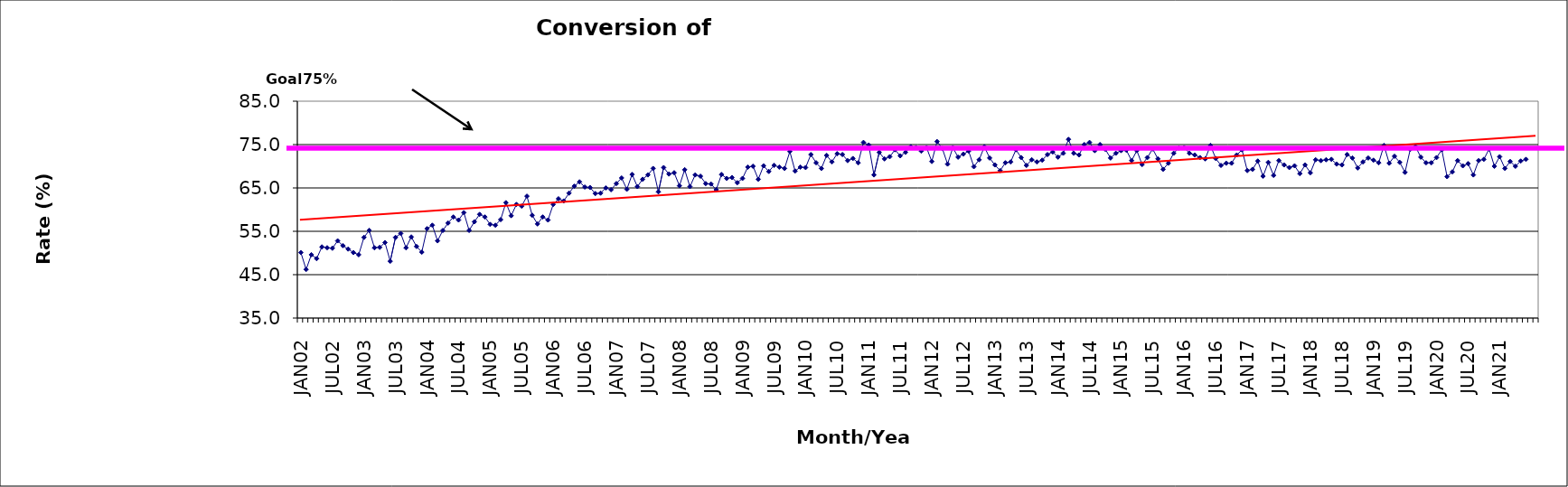
| Category | Series 0 |
|---|---|
| JAN02 | 50.1 |
| FEB02 | 46.2 |
| MAR02 | 49.6 |
| APR02 | 48.7 |
| MAY02 | 51.4 |
| JUN02 | 51.2 |
| JUL02 | 51.1 |
| AUG02 | 52.8 |
| SEP02 | 51.7 |
| OCT02 | 50.9 |
| NOV02 | 50.1 |
| DEC02 | 49.6 |
| JAN03 | 53.6 |
| FEB03 | 55.2 |
| MAR03 | 51.2 |
| APR03 | 51.3 |
| MAY03 | 52.4 |
| JUN03 | 48.1 |
| JUL03 | 53.6 |
| AUG03 | 54.5 |
| SEP03 | 51.2 |
| OCT03 | 53.7 |
| NOV03 | 51.5 |
| DEC03 | 50.2 |
| JAN04 | 55.6 |
| FEB04 | 56.4 |
| MAR04 | 52.8 |
| APR04 | 55.2 |
| MAY04 | 56.9 |
| JUN04 | 58.3 |
| JUL04 | 57.6 |
| AUG04 | 59.3 |
| SEP04 | 55.2 |
| OCT04 | 57.2 |
| NOV04 | 58.9 |
| DEC04 | 58.3 |
| JAN05 | 56.6 |
| FEB05 | 56.4 |
| MAR05 | 57.7 |
| APR05 | 61.6 |
| MAY05 | 58.6 |
| JUN05 | 61.2 |
| JUL05 | 60.8 |
| AUG05 | 63.1 |
| SEP05 | 58.7 |
| OCT05 | 56.7 |
| NOV05 | 58.3 |
| DEC05 | 57.6 |
| JAN06 | 61.2 |
| FEB06 | 62.5 |
| MAR06 | 62 |
| APR06 | 63.8 |
| MAY06 | 65.4 |
| JUN06 | 66.4 |
| JUL06 | 65.2 |
| AUG06 | 65.1 |
| SEP06 | 63.7 |
| OCT06 | 63.8 |
| NOV06 | 65 |
| DEC06 | 64.6 |
| JAN07 | 66 |
| FEB07 | 67.3 |
| MAR07 | 64.7 |
| APR07 | 68.1 |
| MAY07 | 65.3 |
| JUN07 | 67 |
| JUL07 | 68 |
| AUG07 | 69.5 |
| SEP07 | 64.1 |
| OCT07 | 69.7 |
| NOV07 | 68.2 |
| DEC07 | 68.5 |
| JAN08 | 65.5 |
| FEB08 | 69.2 |
| MAR08 | 65.3 |
| APR08 | 68 |
| MAY08 | 67.7 |
| JUN08 | 66 |
| JUL08 | 65.9 |
| AUG08 | 64.6 |
| SEP08 | 68.1 |
| OCT08 | 67.2 |
| NOV08 | 67.4 |
| DEC08 | 66.2 |
| JAN09 | 67.2 |
| FEB09 | 69.8 |
| MAR09 | 70 |
| APR09 | 67 |
| MAY09 | 70.1 |
| JUN09 | 68.8 |
| JUL09 | 70.2 |
| AUG09 | 69.8 |
| SEP09 | 69.5 |
| OCT09 | 73.4 |
| NOV09 | 68.9 |
| DEC09 | 69.8 |
| JAN10 | 69.7 |
| FEB10 | 72.7 |
| MAR10 | 70.8 |
| APR10 | 69.5 |
| MAY10 | 72.5 |
| JUN10 | 71 |
| JUL10 | 72.9 |
| AUG10 | 72.7 |
| SEP10 | 71.3 |
| OCT10 | 71.8 |
| NOV10 | 70.8 |
| DEC10 | 75.5 |
| JAN11 | 74.9 |
| FEB11 | 68 |
| MAR11 | 73.2 |
| APR11 | 71.7 |
| MAY11 | 72.2 |
| JUN11 | 73.8 |
| JUL11 | 72.4 |
| AUG11 | 73.2 |
| SEP11 | 74.5 |
| OCT11 | 74.3 |
| NOV11 | 73.5 |
| DEC11 | 74.3 |
| JAN12 | 71.1 |
| FEB12 | 75.7 |
| MAR12 | 74.1 |
| APR12 | 70.5 |
| MAY12 | 74.3 |
| JUN12 | 72.1 |
| JUL12 | 72.8 |
| AUG12 | 73.5 |
| SEP12 | 69.9 |
| OCT12 | 71.5 |
| NOV12 | 74.5 |
| DEC12 | 71.9 |
| JAN13 | 70.3 |
| FEB13 | 69 |
| MAR13 | 70.8 |
| APR13 | 71 |
| MAY13 | 73.8 |
| JUN13 | 72 |
| JUL13 | 70.2 |
| AUG13 | 71.5 |
| SEP13 | 71 |
| OCT13 | 71.4 |
| NOV13 | 72.7 |
| DEC13 | 73.3 |
| JAN14 | 72.1 |
| FEB14 | 73 |
| MAR14 | 76.2 |
| APR14 | 73 |
| MAY14 | 72.6 |
| JUN14 | 75 |
| JUL14 | 75.5 |
| AUG14 | 73.6 |
| SEP14 | 75 |
| OCT14 | 73.9 |
| NOV14 | 71.9 |
| DEC14 | 73 |
| JAN15 | 73.6 |
| FEB15 | 73.7 |
| MAR15 | 71.3 |
| APR15 | 73.6 |
| MAY15 | 70.4 |
| JUN15 | 72 |
| JUL15 | 74 |
| AUG15 | 71.7 |
| SEP15 | 69.3 |
| OCT15 | 70.7 |
| NOV15 | 73 |
| DEC15 | 74.2 |
| JAN16 | 74.3 |
| FEB16 | 73 |
| MAR16 | 72.6 |
| APR16 | 72 |
| MAY16 | 71.7 |
| JUN16 | 74.8 |
| JUL16 | 71.8 |
| AUG16 | 70.2 |
| SEP16 | 70.7 |
| OCT16 | 70.7 |
| NOV16 | 72.6 |
| DEC16 | 73.8 |
| JAN17 | 69 |
| FEB17 | 69.3 |
| MAR17 | 71.2 |
| APR17 | 67.7 |
| MAY17 | 70.9 |
| JUN17 | 67.9 |
| JUL17 | 71.3 |
| AUG17 | 70.3 |
| SEP17 | 69.7 |
| OCT17 | 70.1 |
| NOV17 | 68.3 |
| DEC17 | 70.3 |
| JAN18 | 68.5 |
| FEB18 | 71.5 |
| MAR18 | 71.3 |
| APR18 | 71.5 |
| MAY18 | 71.6 |
| JUN18 | 70.5 |
| JUL18 | 70.3 |
| AUG18 | 72.7 |
| SEP18 | 71.9 |
| OCT18 | 69.6 |
| NOV18 | 71 |
| DEC18 | 71.9 |
| JAN19 | 71.4 |
| FEB19 | 70.8 |
| MAR19 | 74.8 |
| APR19 | 70.7 |
| MAY19 | 72.3 |
| JUN19 | 70.9 |
| JUL19 | 68.6 |
| AUG19 | 73.9 |
| SEP19 | 74.5 |
| OCT19 | 72.1 |
| NOV19 | 70.8 |
| DEC19 | 70.8 |
| JAN20 | 72 |
| FEB20 | 73.8 |
| MAR20 | 67.6 |
| APR20 | 68.7 |
| MAY20 | 71.3 |
| JUN20 | 70.1 |
| JUL20 | 70.6 |
| AUG20 | 68 |
| SEP20 | 71.3 |
| OCT20 | 71.6 |
| NOV20 | 74 |
| DEC20 | 70 |
| JAN21 | 72.2 |
| FEB21 | 69.5 |
| MAR21 | 71.1 |
| APR21 | 70 |
| MAY21 | 71.2 |
| JUN21 | 71.6 |